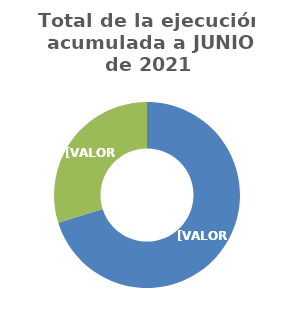
| Category | Total de la ejecución acumulada a junio de 2020) |
|---|---|
| Avance 1° Semestre
(ejecución acumulada a junio de 2020) | 0.702 |
| Diferencia
(ejecución faltante para completar la meta establecida) | 0.298 |